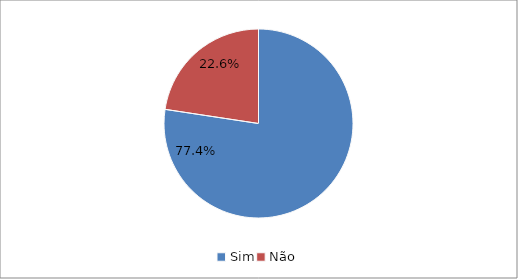
| Category | Series 0 |
|---|---|
| Sim | 0.774 |
| Não | 0.226 |